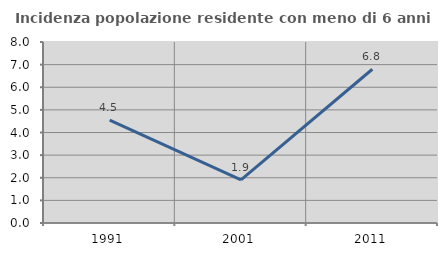
| Category | Incidenza popolazione residente con meno di 6 anni |
|---|---|
| 1991.0 | 4.545 |
| 2001.0 | 1.905 |
| 2011.0 | 6.796 |